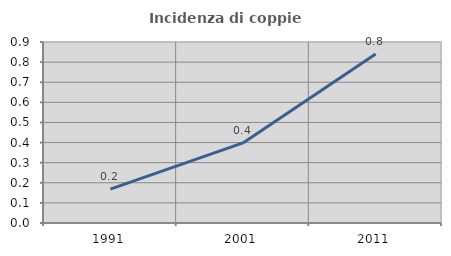
| Category | Incidenza di coppie miste |
|---|---|
| 1991.0 | 0.168 |
| 2001.0 | 0.398 |
| 2011.0 | 0.841 |